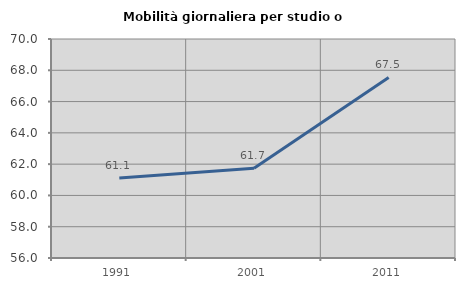
| Category | Mobilità giornaliera per studio o lavoro |
|---|---|
| 1991.0 | 61.111 |
| 2001.0 | 61.735 |
| 2011.0 | 67.543 |